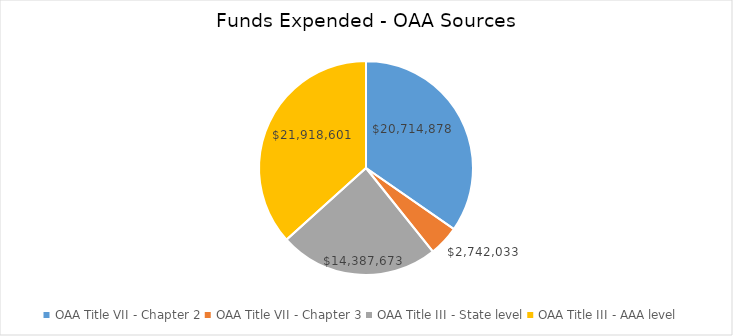
| Category | Funds Expended |
|---|---|
| OAA Title VII - Chapter 2 | 20714877.58 |
| OAA Title VII - Chapter 3 | 2742032.86 |
| OAA Title III - State level | 14387672.74 |
| OAA Title III - AAA level | 21918600.75 |